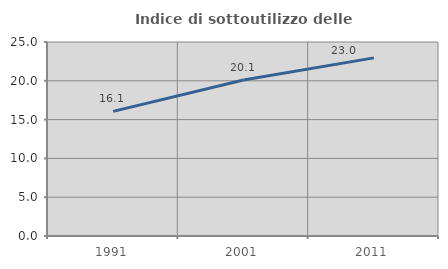
| Category | Indice di sottoutilizzo delle abitazioni  |
|---|---|
| 1991.0 | 16.059 |
| 2001.0 | 20.102 |
| 2011.0 | 22.955 |